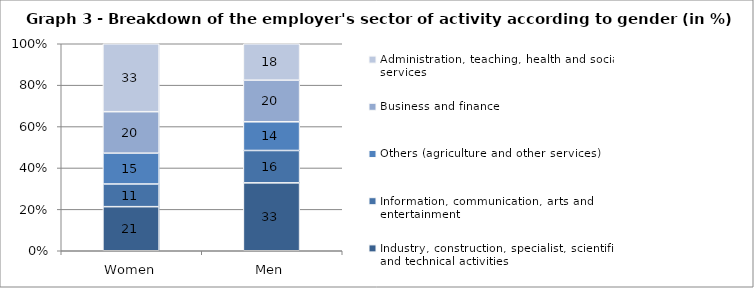
| Category | Industry, construction, specialist, scientific and technical activities | Information, communication, arts and entertainment | Others (agriculture and other services) | Business and finance | Administration, teaching, health and social services |
|---|---|---|---|---|---|
| Women | 21.3 | 10.95 | 14.9 | 20.04 | 32.82 |
| Men | 32.8 | 15.63 | 13.87 | 20.09 | 17.61 |